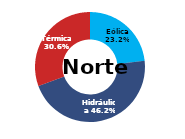
| Category | Norte |
|---|---|
| Eólica | 88.261 |
| Hidráulica | 175.603 |
| Solar | 0 |
| Térmica | 116.45 |